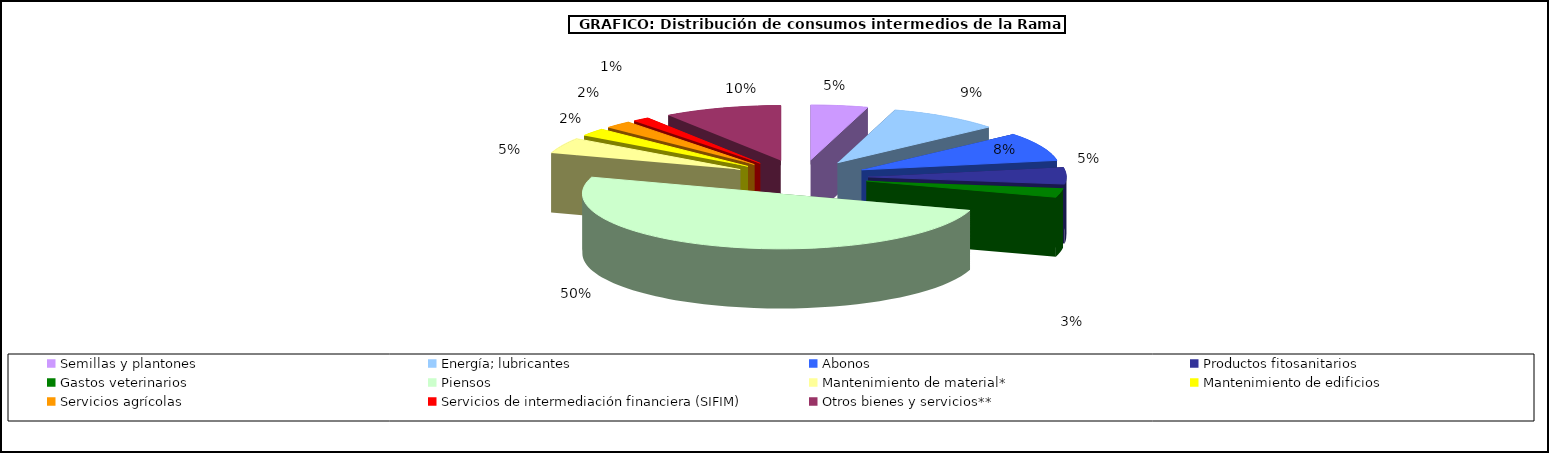
| Category | Consumos Intermedios |
|---|---|
| Semillas y plantones  | 4.656 |
| Energía; lubricantes | 9.14 |
| Abonos | 8.438 |
| Productos fitosanitarios | 4.851 |
| Gastos veterinarios | 2.692 |
| Piensos | 50.114 |
| Mantenimiento de material* | 4.628 |
| Mantenimiento de edificios | 2.269 |
| Servicios agrícolas | 2.239 |
| Servicios de intermediación financiera (SIFIM) | 1.374 |
| Otros bienes y servicios** | 9.6 |